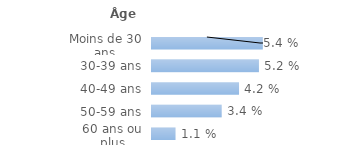
| Category | Series 0 |
|---|---|
| Moins de 30 ans | 0.054 |
| 30-39 ans | 0.052 |
| 40-49 ans | 0.042 |
| 50-59 ans | 0.034 |
| 60 ans ou plus | 0.011 |